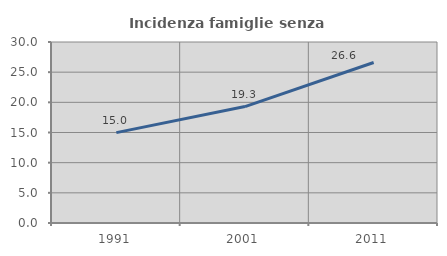
| Category | Incidenza famiglie senza nuclei |
|---|---|
| 1991.0 | 14.98 |
| 2001.0 | 19.302 |
| 2011.0 | 26.602 |